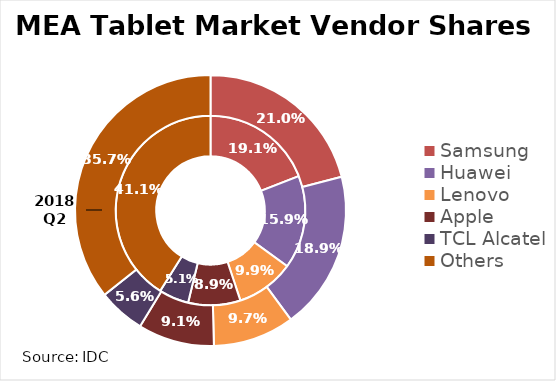
| Category | 2017 Q2 | 2018 Q2 |
|---|---|---|
| Samsung | 0.191 | 0.21 |
| Huawei | 0.159 | 0.189 |
| Lenovo | 0.099 | 0.097 |
| Apple | 0.089 | 0.091 |
| TCL Alcatel | 0.051 | 0.056 |
| Others | 0.411 | 0.357 |